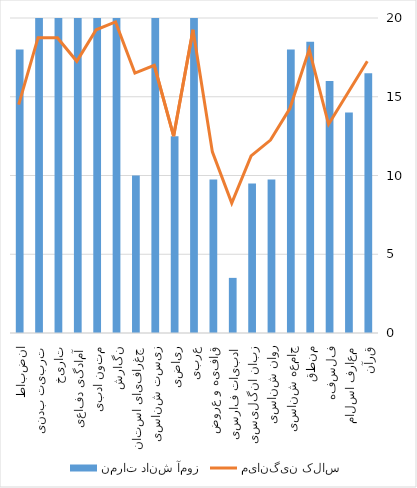
| Category | نمرات دانش آموز |
|---|---|
| قرآن | 16.5 |
| معارف اسلامی | 14 |
| فلسفه | 16 |
| منطق | 18.5 |
| جامعه شناسی | 18 |
| روان شناسی | 9.75 |
| زبان انگلیسی | 9.5 |
| ادبیات فارسی | 3.5 |
| قافیه و عروض | 9.75 |
| عربی | 20 |
| ریاضی | 12.5 |
| زیست شناسی | 20 |
| جغرافیای استان | 10 |
| نگارش | 20 |
| متون ادبی | 20 |
| آمادگی دفاعی | 20 |
| تاریخ | 20 |
| تربیت بدنی | 20 |
| انضباط | 18 |